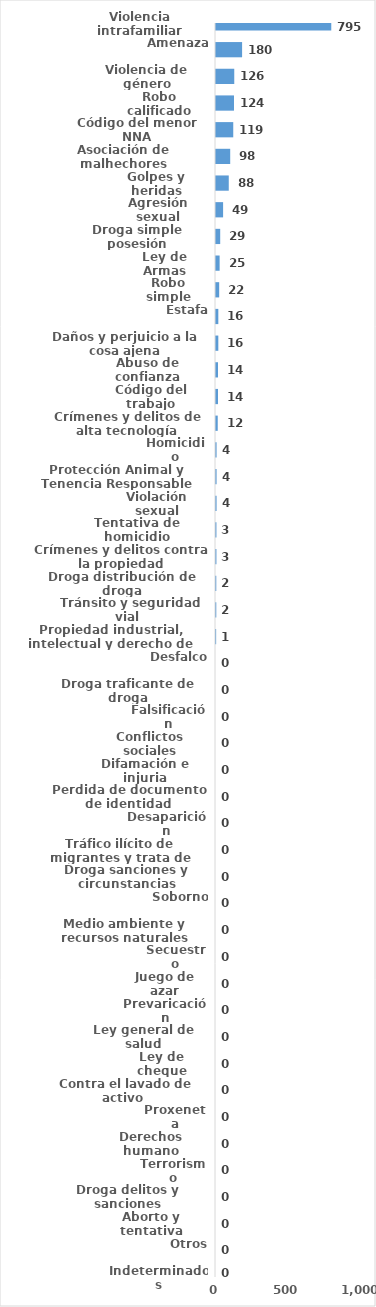
| Category | Series 0 |
|---|---|
| Violencia intrafamiliar | 795 |
| Amenaza | 180 |
| Violencia de género | 126 |
| Robo calificado | 124 |
| Código del menor NNA | 119 |
| Asociación de malhechores | 98 |
| Golpes y heridas | 88 |
| Agresión sexual | 49 |
| Droga simple posesión | 29 |
| Ley de Armas | 25 |
| Robo simple | 22 |
| Estafa | 16 |
| Daños y perjuicio a la cosa ajena | 16 |
| Abuso de confianza | 14 |
| Código del trabajo | 14 |
| Crímenes y delitos de alta tecnología | 12 |
| Homicidio | 4 |
| Protección Animal y Tenencia Responsable | 4 |
| Violación sexual | 4 |
| Tentativa de homicidio | 3 |
| Crímenes y delitos contra la propiedad | 3 |
| Droga distribución de droga | 2 |
| Tránsito y seguridad vial  | 2 |
| Propiedad industrial, intelectual y derecho de autor | 1 |
| Desfalco | 0 |
| Droga traficante de droga | 0 |
| Falsificación | 0 |
| Conflictos sociales | 0 |
| Difamación e injuria | 0 |
| Perdida de documento de identidad | 0 |
| Desaparición | 0 |
| Tráfico ilícito de migrantes y trata de personas | 0 |
| Droga sanciones y circunstancias agravantes | 0 |
| Soborno | 0 |
| Medio ambiente y recursos naturales | 0 |
| Secuestro | 0 |
| Juego de azar | 0 |
| Prevaricación | 0 |
| Ley general de salud | 0 |
| Ley de cheque | 0 |
| Contra el lavado de activo  | 0 |
| Proxeneta | 0 |
| Derechos humano | 0 |
| Terrorismo | 0 |
| Droga delitos y sanciones | 0 |
| Aborto y tentativa | 0 |
| Otros | 0 |
| Indeterminados | 0 |